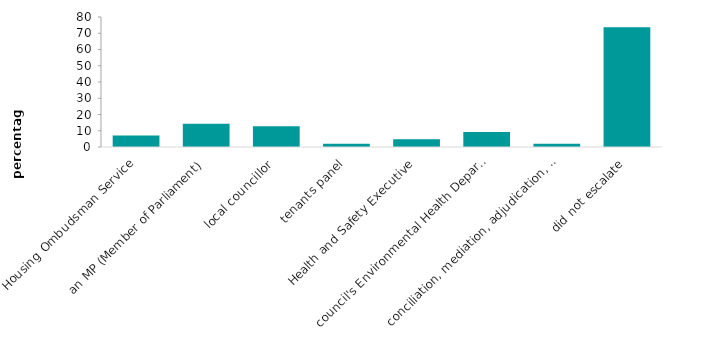
| Category | all social renters |
|---|---|
| Housing Ombudsman Service | 7.097 |
| an MP (Member of Parliament) | 14.337 |
| local councillor | 12.698 |
| tenants panel | 1.983 |
| Health and Safety Executive | 4.722 |
| council's Environmental Health Department | 9.288 |
| conciliation, mediation, adjudication, arbitration | 2.028 |
| did not escalate | 73.703 |